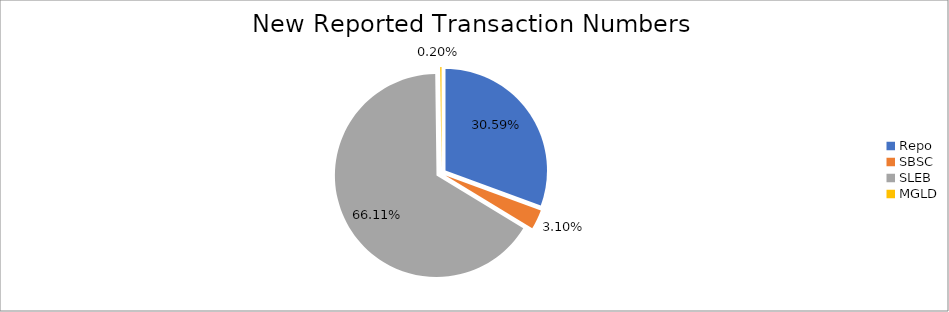
| Category | Series 0 |
|---|---|
| Repo | 403806 |
| SBSC | 40924 |
| SLEB | 872732 |
| MGLD | 2630 |